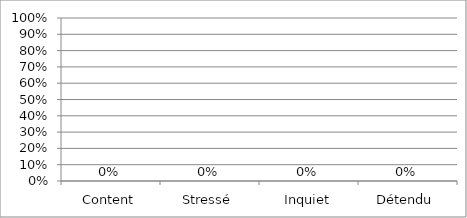
| Category | Series 0 |
|---|---|
| Content | 0 |
| Stressé | 0 |
| Inquiet | 0 |
| Détendu | 0 |